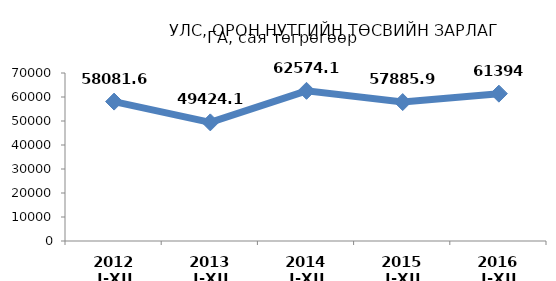
| Category | ТӨСВИЙН ЗАРЛАГА |
|---|---|
| 2012 I-XII | 58081.6 |
| 2013 I-XII | 49424.1 |
| 2014 I-XII | 62574.1 |
| 2015 I-XII | 57885.9 |
| 2016 I-XII | 61394 |